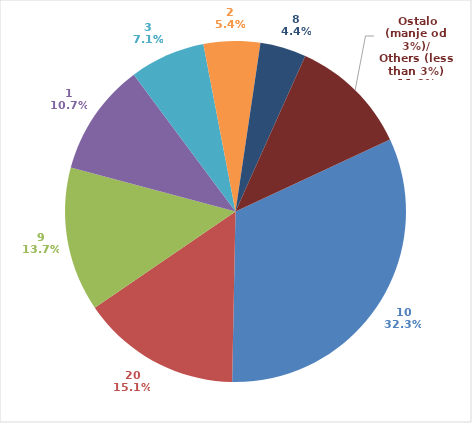
| Category | Series 0 | Series 1 |
|---|---|---|
| 10 | 12611360.77 | 32.258 |
| 20 | 5917416.01 | 15.136 |
| 9 | 5355883.44 | 13.699 |
| 1 | 4175921.16 | 10.681 |
| 3 | 2794732.19 | 7.148 |
| 2 | 2096761.85 | 5.363 |
| 8 | 1706933.61 | 4.366 |
|  Ostalo (manje od 3%)/
Others (less than 3%) | 4436479.73 | 0.113 |